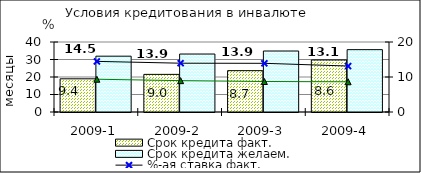
| Category | Срок кредита факт.  | Срок кредита желаем. |
|---|---|---|
| 2009-1 | 18.96 | 31.9 |
| 2009-2 | 21.5 | 33.13 |
| 2009-3 | 23.63 | 34.85 |
| 2009-4 | 29.73 | 35.63 |